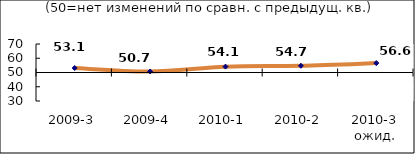
| Category | Диф.индекс ↓ |
|---|---|
| 2009-3 | 53.125 |
| 2009-4 | 50.73 |
| 2010-1 | 54.12 |
| 2010-2 | 54.73 |
| 2010-3 ожид. | 56.61 |